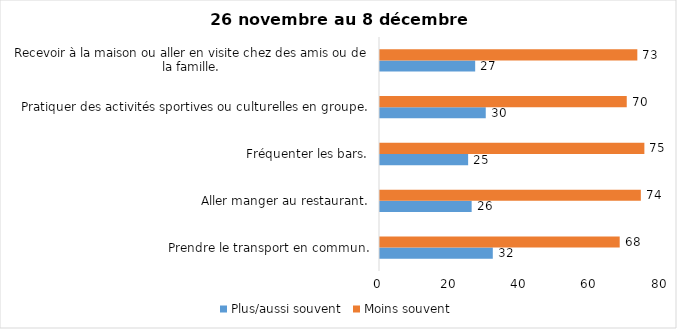
| Category | Plus/aussi souvent | Moins souvent |
|---|---|---|
| Prendre le transport en commun. | 32 | 68 |
| Aller manger au restaurant. | 26 | 74 |
| Fréquenter les bars. | 25 | 75 |
| Pratiquer des activités sportives ou culturelles en groupe. | 30 | 70 |
| Recevoir à la maison ou aller en visite chez des amis ou de la famille. | 27 | 73 |